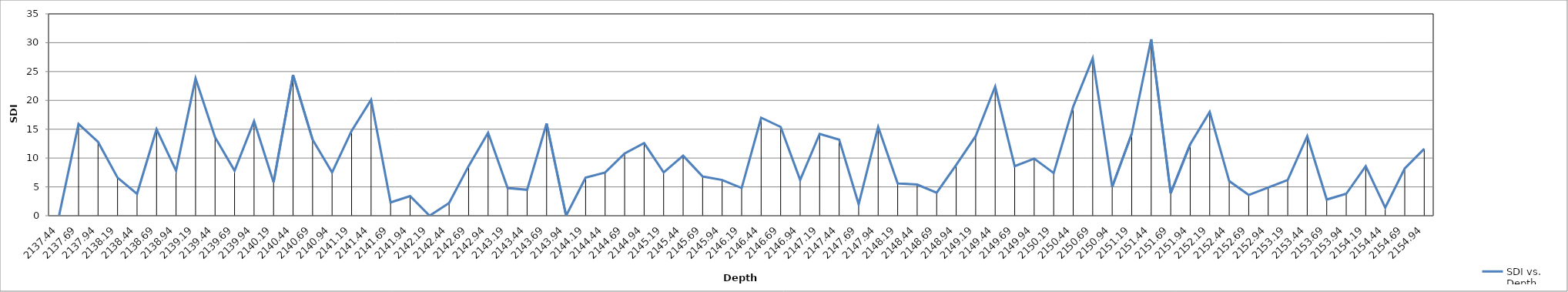
| Category | SDI vs. Depth |
|---|---|
| 2137.44 | 0 |
| 2137.69 | 15.9 |
| 2137.94 | 12.8 |
| 2138.19 | 6.6 |
| 2138.44 | 3.8 |
| 2138.69 | 15 |
| 2138.94 | 7.8 |
| 2139.19 | 23.8 |
| 2139.44 | 13.6 |
| 2139.69 | 7.8 |
| 2139.94 | 16.4 |
| 2140.19 | 5.8 |
| 2140.44 | 24.4 |
| 2140.69 | 13.2 |
| 2140.94 | 7.5 |
| 2141.19 | 14.7 |
| 2141.44 | 20.1 |
| 2141.69 | 2.3 |
| 2141.94 | 3.4 |
| 2142.19 | 0 |
| 2142.44 | 2.2 |
| 2142.69 | 8.6 |
| 2142.94 | 14.4 |
| 2143.19 | 4.8 |
| 2143.44 | 4.5 |
| 2143.69 | 16 |
| 2143.94 | 0 |
| 2144.19 | 6.6 |
| 2144.44 | 7.5 |
| 2144.69 | 10.8 |
| 2144.94 | 12.6 |
| 2145.19 | 7.5 |
| 2145.44 | 10.4 |
| 2145.69 | 6.8 |
| 2145.94 | 6.2 |
| 2146.19 | 4.8 |
| 2146.44 | 17 |
| 2146.69 | 15.4 |
| 2146.94 | 6.2 |
| 2147.19 | 14.2 |
| 2147.44 | 13.2 |
| 2147.69 | 2 |
| 2147.94 | 15.4 |
| 2148.19 | 5.6 |
| 2148.44 | 5.4 |
| 2148.69 | 4 |
| 2148.94 | 8.8 |
| 2149.19 | 13.8 |
| 2149.44 | 22.4 |
| 2149.69 | 8.6 |
| 2149.94 | 9.9 |
| 2150.19 | 7.4 |
| 2150.44 | 18.9 |
| 2150.69 | 27.3 |
| 2150.94 | 5 |
| 2151.19 | 14.2 |
| 2151.44 | 30.6 |
| 2151.69 | 3.9 |
| 2151.94 | 12.4 |
| 2152.19 | 18 |
| 2152.44 | 6 |
| 2152.69 | 3.6 |
| 2152.94 | 4.9 |
| 2153.19 | 6.2 |
| 2153.44 | 13.8 |
| 2153.69 | 2.8 |
| 2153.94 | 3.8 |
| 2154.19 | 8.6 |
| 2154.44 | 1.4 |
| 2154.69 | 8.2 |
| 2154.94 | 11.6 |